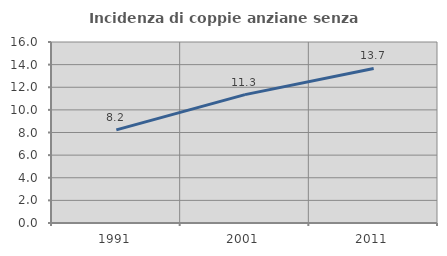
| Category | Incidenza di coppie anziane senza figli  |
|---|---|
| 1991.0 | 8.231 |
| 2001.0 | 11.349 |
| 2011.0 | 13.665 |